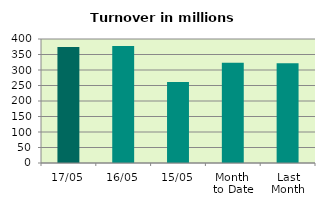
| Category | Series 0 |
|---|---|
| 17/05 | 374.393 |
| 16/05 | 377.214 |
| 15/05 | 261.21 |
| Month 
to Date | 323.394 |
| Last
Month | 322.024 |